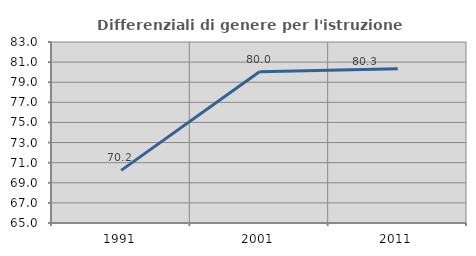
| Category | Differenziali di genere per l'istruzione superiore |
|---|---|
| 1991.0 | 70.232 |
| 2001.0 | 80.034 |
| 2011.0 | 80.336 |